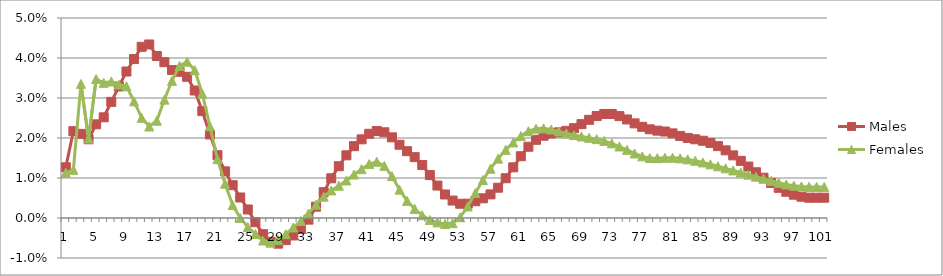
| Category | Males | Females |
|---|---|---|
| 0 | 0.013 | 0.011 |
| 1 | 0.022 | 0.012 |
| 2 | 0.021 | 0.034 |
| 3 | 0.02 | 0.02 |
| 4 | 0.023 | 0.035 |
| 5 | 0.025 | 0.034 |
| 6 | 0.029 | 0.034 |
| 7 | 0.033 | 0.033 |
| 8 | 0.037 | 0.033 |
| 9 | 0.04 | 0.029 |
| 10 | 0.043 | 0.025 |
| 11 | 0.043 | 0.023 |
| 12 | 0.041 | 0.024 |
| 13 | 0.039 | 0.03 |
| 14 | 0.037 | 0.034 |
| 15 | 0.037 | 0.038 |
| 16 | 0.035 | 0.039 |
| 17 | 0.032 | 0.037 |
| 18 | 0.027 | 0.031 |
| 19 | 0.021 | 0.023 |
| 20 | 0.016 | 0.015 |
| 21 | 0.012 | 0.009 |
| 22 | 0.008 | 0.003 |
| 23 | 0.005 | 0 |
| 24 | 0.002 | -0.002 |
| 25 | -0.001 | -0.004 |
| 26 | -0.004 | -0.006 |
| 27 | -0.006 | -0.006 |
| 28 | -0.006 | -0.006 |
| 29 | -0.006 | -0.004 |
| 30 | -0.004 | -0.002 |
| 31 | -0.003 | -0.001 |
| 32 | 0 | 0.001 |
| 33 | 0.003 | 0.003 |
| 34 | 0.006 | 0.005 |
| 35 | 0.01 | 0.007 |
| 36 | 0.013 | 0.008 |
| 37 | 0.016 | 0.009 |
| 38 | 0.018 | 0.011 |
| 39 | 0.02 | 0.012 |
| 40 | 0.021 | 0.013 |
| 41 | 0.022 | 0.014 |
| 42 | 0.021 | 0.013 |
| 43 | 0.02 | 0.01 |
| 44 | 0.018 | 0.007 |
| 45 | 0.017 | 0.004 |
| 46 | 0.015 | 0.002 |
| 47 | 0.013 | 0.001 |
| 48 | 0.011 | 0 |
| 49 | 0.008 | -0.001 |
| 50 | 0.006 | -0.002 |
| 51 | 0.004 | -0.001 |
| 52 | 0.004 | 0 |
| 53 | 0.004 | 0.003 |
| 54 | 0.004 | 0.006 |
| 55 | 0.005 | 0.01 |
| 56 | 0.006 | 0.012 |
| 57 | 0.008 | 0.015 |
| 58 | 0.01 | 0.017 |
| 59 | 0.013 | 0.019 |
| 60 | 0.015 | 0.02 |
| 61 | 0.018 | 0.022 |
| 62 | 0.02 | 0.022 |
| 63 | 0.021 | 0.022 |
| 64 | 0.021 | 0.022 |
| 65 | 0.021 | 0.022 |
| 66 | 0.022 | 0.021 |
| 67 | 0.022 | 0.021 |
| 68 | 0.023 | 0.02 |
| 69 | 0.025 | 0.02 |
| 70 | 0.025 | 0.02 |
| 71 | 0.026 | 0.019 |
| 72 | 0.026 | 0.019 |
| 73 | 0.025 | 0.018 |
| 74 | 0.025 | 0.017 |
| 75 | 0.024 | 0.016 |
| 76 | 0.023 | 0.015 |
| 77 | 0.022 | 0.015 |
| 78 | 0.022 | 0.015 |
| 79 | 0.022 | 0.015 |
| 80 | 0.021 | 0.015 |
| 81 | 0.021 | 0.015 |
| 82 | 0.02 | 0.015 |
| 83 | 0.02 | 0.014 |
| 84 | 0.019 | 0.014 |
| 85 | 0.019 | 0.013 |
| 86 | 0.018 | 0.013 |
| 87 | 0.017 | 0.012 |
| 88 | 0.016 | 0.012 |
| 89 | 0.014 | 0.011 |
| 90 | 0.013 | 0.011 |
| 91 | 0.011 | 0.01 |
| 92 | 0.01 | 0.01 |
| 93 | 0.009 | 0.009 |
| 94 | 0.008 | 0.009 |
| 95 | 0.007 | 0.008 |
| 96 | 0.006 | 0.008 |
| 97 | 0.005 | 0.008 |
| 98 | 0.005 | 0.008 |
| 99 | 0.005 | 0.008 |
| 100 | 0.005 | 0.008 |